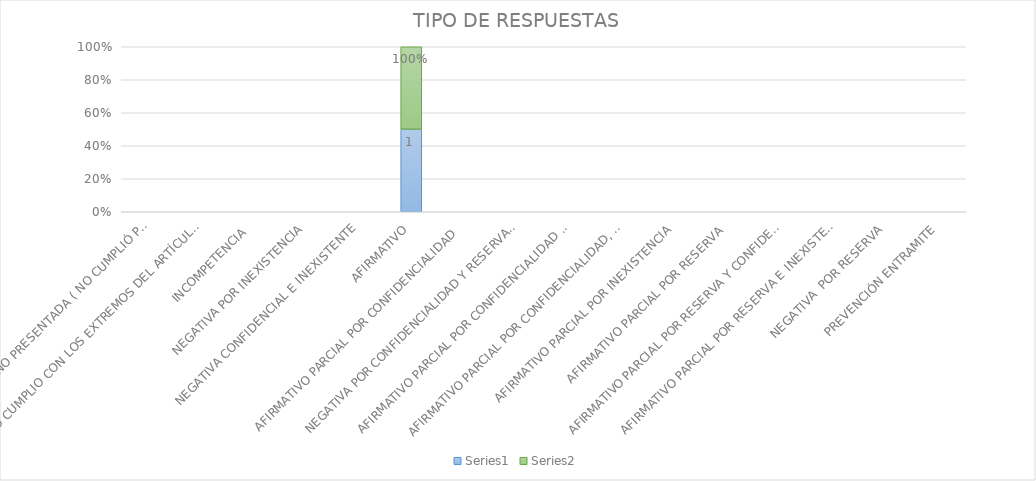
| Category | Series 4 | Series 5 |
|---|---|---|
| SE TIENE POR NO PRESENTADA ( NO CUMPLIÓ PREVENCIÓN) | 0 | 0 |
| NO CUMPLIO CON LOS EXTREMOS DEL ARTÍCULO 79 (REQUISITOS) | 0 | 0 |
| INCOMPETENCIA  | 0 | 0 |
| NEGATIVA POR INEXISTENCIA | 0 | 0 |
| NEGATIVA CONFIDENCIAL E INEXISTENTE | 0 | 0 |
| AFIRMATIVO | 1 | 1 |
| AFIRMATIVO PARCIAL POR CONFIDENCIALIDAD  | 0 | 0 |
| NEGATIVA POR CONFIDENCIALIDAD Y RESERVADA | 0 | 0 |
| AFIRMATIVO PARCIAL POR CONFIDENCIALIDAD E INEXISTENCIA | 0 | 0 |
| AFIRMATIVO PARCIAL POR CONFIDENCIALIDAD, RESERVA E INEXISTENCIA | 0 | 0 |
| AFIRMATIVO PARCIAL POR INEXISTENCIA | 0 | 0 |
| AFIRMATIVO PARCIAL POR RESERVA | 0 | 0 |
| AFIRMATIVO PARCIAL POR RESERVA Y CONFIDENCIALIDAD | 0 | 0 |
| AFIRMATIVO PARCIAL POR RESERVA E INEXISTENCIA | 0 | 0 |
| NEGATIVA  POR RESERVA | 0 | 0 |
| PREVENCIÓN ENTRAMITE | 0 | 0 |